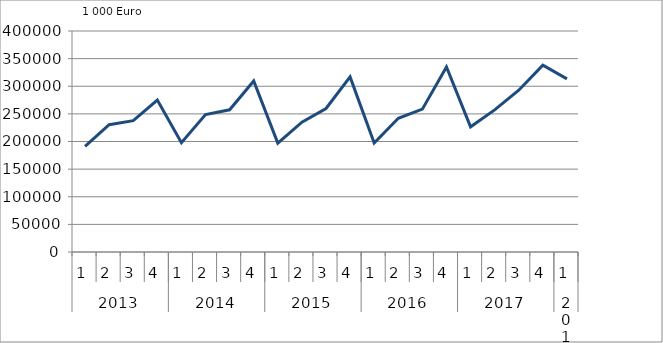
| Category | Ausbaugewerblicher Umsatz3 |
|---|---|
| 0 | 191088.978 |
| 1 | 230353.875 |
| 2 | 237735.574 |
| 3 | 275098.219 |
| 4 | 197732.754 |
| 5 | 248690.349 |
| 6 | 257339.084 |
| 7 | 309632.186 |
| 8 | 197030.42 |
| 9 | 235094.994 |
| 10 | 259758.438 |
| 11 | 316833.232 |
| 12 | 197219.532 |
| 13 | 242069.899 |
| 14 | 258547.84 |
| 15 | 334764.305 |
| 16 | 226552.317 |
| 17 | 257191.13 |
| 18 | 292853.372 |
| 19 | 338154.691 |
| 20 | 313433.569 |